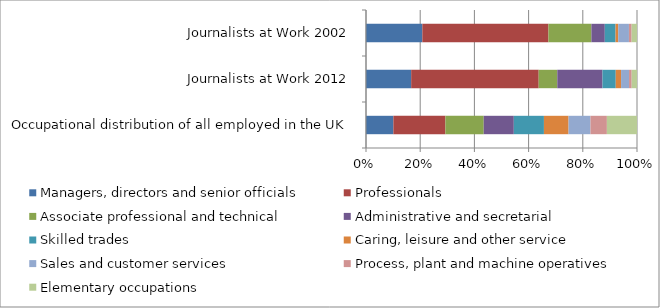
| Category | Managers, directors and senior officials | Professionals | Associate professional and technical | Administrative and secretarial | Skilled trades | Caring, leisure and other service | Sales and customer services | Process, plant and machine operatives | Elementary occupations |
|---|---|---|---|---|---|---|---|---|---|
| Occupational distribution of all employed in the UK | 10 | 19 | 14 | 11 | 11 | 9 | 8 | 6 | 11 |
| Journalists at Work 2012 | 17 | 48 | 7 | 17 | 5 | 2 | 3 | 1 | 2 |
| Journalists at Work 2002 | 21 | 47 | 16 | 5 | 4 | 1 | 4 | 1 | 2 |